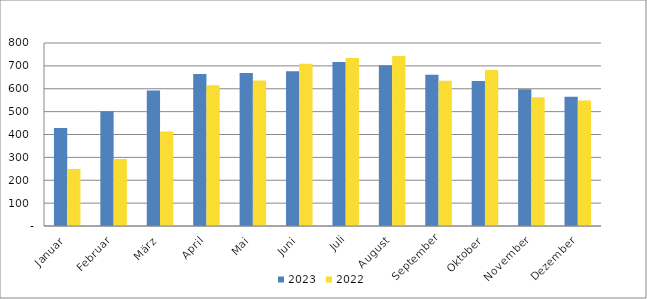
| Category | 2023 | 2022 |
|---|---|---|
| Januar | 427995 | 249407 |
| Februar | 501554 | 292650 |
| März | 592036 | 412682 |
| April | 664672 | 615747 |
| Mai | 668518 | 635639 |
| Juni | 676091 | 709278 |
| Juli | 716816 | 734350 |
| August | 702865 | 742628 |
| September | 661501 | 634753 |
| Oktober | 633785 | 682375 |
| November | 597557 | 563356 |
| Dezember | 564938 | 548306 |